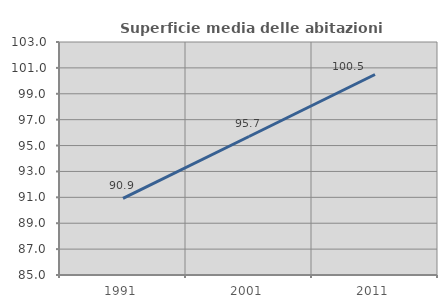
| Category | Superficie media delle abitazioni occupate |
|---|---|
| 1991.0 | 90.925 |
| 2001.0 | 95.7 |
| 2011.0 | 100.491 |